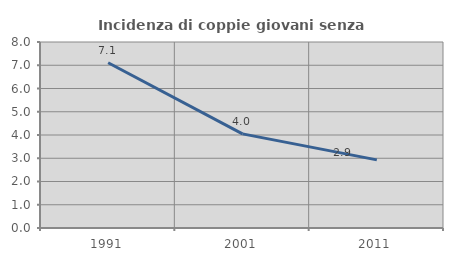
| Category | Incidenza di coppie giovani senza figli |
|---|---|
| 1991.0 | 7.107 |
| 2001.0 | 4.049 |
| 2011.0 | 2.931 |